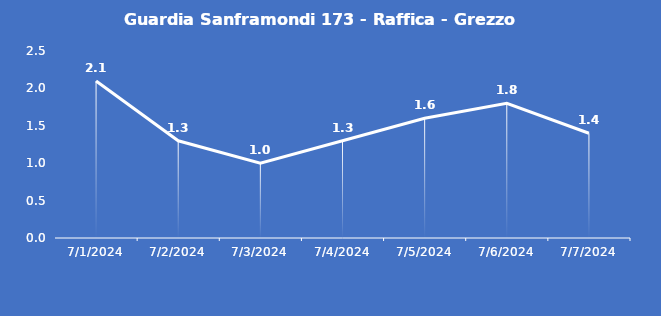
| Category | Guardia Sanframondi 173 - Raffica - Grezzo (m/s) |
|---|---|
| 7/1/24 | 2.1 |
| 7/2/24 | 1.3 |
| 7/3/24 | 1 |
| 7/4/24 | 1.3 |
| 7/5/24 | 1.6 |
| 7/6/24 | 1.8 |
| 7/7/24 | 1.4 |